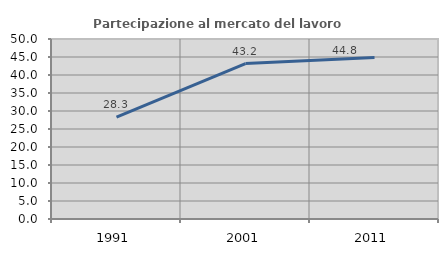
| Category | Partecipazione al mercato del lavoro  femminile |
|---|---|
| 1991.0 | 28.272 |
| 2001.0 | 43.169 |
| 2011.0 | 44.828 |